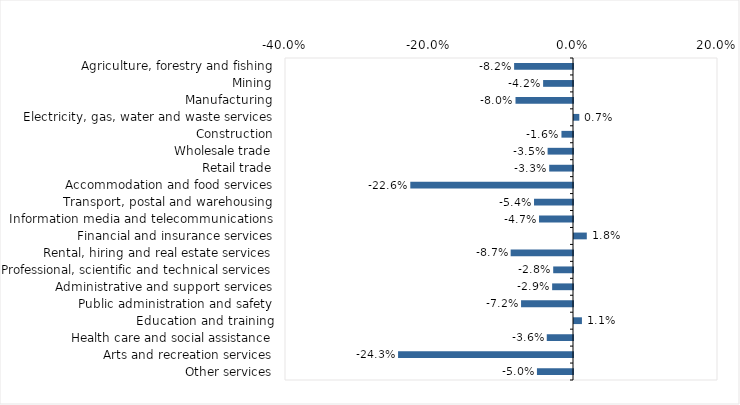
| Category | This week |
|---|---|
| Agriculture, forestry and fishing | -0.082 |
| Mining | -0.042 |
| Manufacturing | -0.08 |
| Electricity, gas, water and waste services | 0.007 |
| Construction | -0.016 |
| Wholesale trade | -0.035 |
| Retail trade | -0.033 |
| Accommodation and food services | -0.226 |
| Transport, postal and warehousing | -0.054 |
| Information media and telecommunications | -0.047 |
| Financial and insurance services | 0.018 |
| Rental, hiring and real estate services | -0.087 |
| Professional, scientific and technical services | -0.028 |
| Administrative and support services | -0.029 |
| Public administration and safety | -0.072 |
| Education and training | 0.011 |
| Health care and social assistance | -0.036 |
| Arts and recreation services | -0.243 |
| Other services | -0.05 |